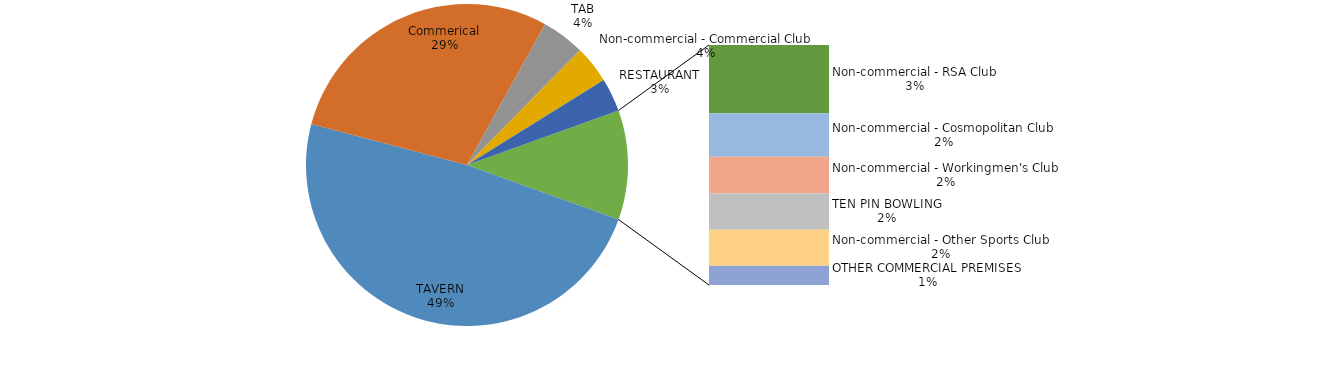
| Category | Series 0 |
|---|---|
| TAVERN | 103476803.92 |
| Commerical | 61681076.63 |
| TAB | 9193796.06 |
| Non-commercial - Commercial Club | 7993666.67 |
| RESTAURANT | 7164680.66 |
| Non-commercial - RSA Club | 6664999.19 |
| Non-commercial - Cosmopolitan Club | 4244175.38 |
| Non-commercial - Workingmen's Club | 3567786.03 |
| TEN PIN BOWLING | 3549336.22 |
| Non-commercial - Other Sports Club | 3522947.03 |
| OTHER COMMERCIAL PREMISES | 1866150.16 |